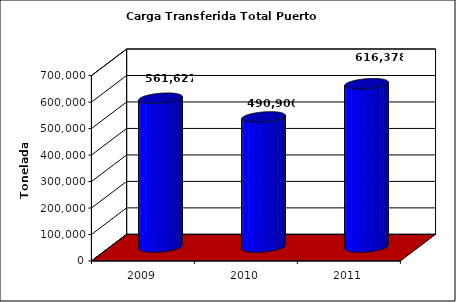
| Category | Series 0 |
|---|---|
| 2009.0 | 561627 |
| 2010.0 | 490900 |
| 2011.0 | 616378 |